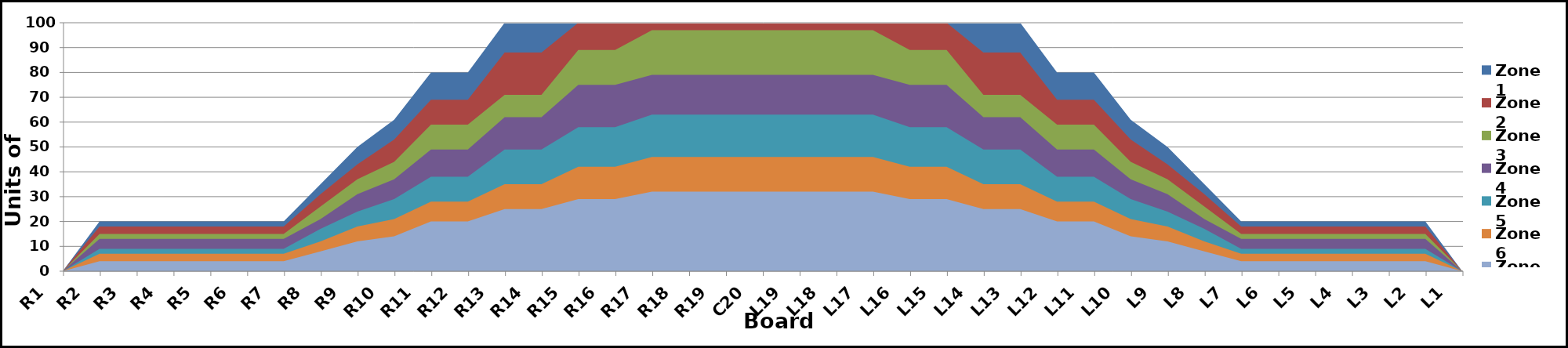
| Category | Zone 1 | Zone 2 | Zone 3 | Zone 4 | Zone 5 | Zone 6 | Zone 7 | Zone 8 |
|---|---|---|---|---|---|---|---|---|
| L1 | 0 | 0 | 0 | 0 | 0 | 0 | 0 | 0 |
| L2 | 20 | 18 | 15 | 13 | 9 | 7 | 4 | 0 |
| L3 | 20 | 18 | 15 | 13 | 9 | 7 | 4 | 0 |
| L4 | 20 | 18 | 15 | 13 | 9 | 7 | 4 | 0 |
| L5 | 20 | 18 | 15 | 13 | 9 | 7 | 4 | 0 |
| L6 | 20 | 18 | 15 | 13 | 9 | 7 | 4 | 0 |
| L7 | 20 | 18 | 15 | 13 | 9 | 7 | 4 | 0 |
| L8 | 35 | 31 | 26 | 21 | 17 | 12 | 8 | 0 |
| L9 | 50 | 43 | 37 | 31 | 24 | 18 | 12 | 0 |
| L10 | 61 | 53 | 44 | 37 | 29 | 21 | 14 | 0 |
| L11 | 80 | 69 | 59 | 49 | 38 | 28 | 20 | 0 |
| L12 | 80 | 69 | 59 | 49 | 38 | 28 | 20 | 0 |
| L13 | 100 | 88 | 71 | 62 | 49 | 35 | 25 | 0 |
| L14 | 100 | 88 | 71 | 62 | 49 | 35 | 25 | 0 |
| L15 | 100 | 100 | 89 | 75 | 58 | 42 | 29 | 0 |
| L16 | 100 | 100 | 89 | 75 | 58 | 42 | 29 | 0 |
| L17 | 100 | 100 | 97 | 79 | 63 | 46 | 32 | 0 |
| L18 | 100 | 100 | 97 | 79 | 63 | 46 | 32 | 0 |
| L19 | 100 | 100 | 97 | 79 | 63 | 46 | 32 | 0 |
| C20 | 100 | 100 | 97 | 79 | 63 | 46 | 32 | 0 |
| R19 | 100 | 100 | 97 | 79 | 63 | 46 | 32 | 0 |
| R18 | 100 | 100 | 97 | 79 | 63 | 46 | 32 | 0 |
| R17 | 100 | 100 | 97 | 79 | 63 | 46 | 32 | 0 |
| R16 | 100 | 100 | 89 | 75 | 58 | 42 | 29 | 0 |
| R15 | 100 | 100 | 89 | 75 | 58 | 42 | 29 | 0 |
| R14 | 100 | 88 | 71 | 62 | 49 | 35 | 25 | 0 |
| R13 | 100 | 88 | 71 | 62 | 49 | 35 | 25 | 0 |
| R12 | 80 | 69 | 59 | 49 | 38 | 28 | 20 | 0 |
| R11 | 80 | 69 | 59 | 49 | 38 | 28 | 20 | 0 |
| R10 | 61 | 53 | 44 | 37 | 29 | 21 | 14 | 0 |
| R9 | 50 | 43 | 37 | 31 | 24 | 18 | 12 | 0 |
| R8 | 35 | 31 | 26 | 21 | 17 | 12 | 8 | 0 |
| R7 | 20 | 18 | 15 | 13 | 9 | 7 | 4 | 0 |
| R6 | 20 | 18 | 15 | 13 | 9 | 7 | 4 | 0 |
| R5 | 20 | 18 | 15 | 13 | 9 | 7 | 4 | 0 |
| R4 | 20 | 18 | 15 | 13 | 9 | 7 | 4 | 0 |
| R3 | 20 | 18 | 15 | 13 | 9 | 7 | 4 | 0 |
| R2 | 20 | 18 | 15 | 13 | 9 | 7 | 4 | 0 |
| R1 | 0 | 0 | 0 | 0 | 0 | 0 | 0 | 0 |